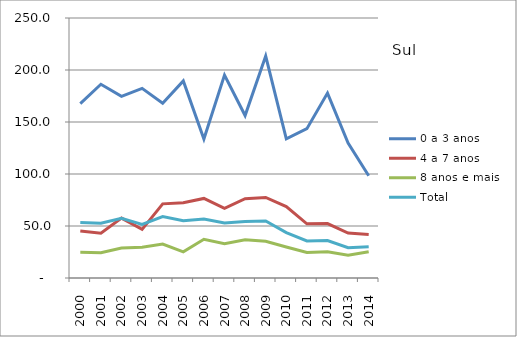
| Category | 0 a 3 anos | 4 a 7 anos | 8 anos e mais | Total |
|---|---|---|---|---|
| 2000.0 | 167.6 | 45.3 | 24.7 | 53.4 |
| 2001.0 | 186.3 | 43.1 | 24.3 | 52.6 |
| 2002.0 | 174.6 | 57.6 | 28.9 | 57.4 |
| 2003.0 | 182.3 | 46.7 | 29.5 | 51.6 |
| 2004.0 | 168 | 71.3 | 32.6 | 59 |
| 2005.0 | 189.5 | 72.4 | 25.1 | 55.1 |
| 2006.0 | 133.6 | 76.5 | 37.2 | 56.7 |
| 2007.0 | 195.1 | 66.9 | 32.9 | 52.9 |
| 2008.0 | 156.2 | 76.2 | 36.8 | 54.4 |
| 2009.0 | 213.4 | 77.5 | 35.4 | 54.9 |
| 2010.0 | 133.839 | 68.695 | 29.763 | 43.722 |
| 2011.0 | 143.616 | 52.089 | 24.461 | 35.648 |
| 2012.0 | 177.785 | 52.319 | 25.2 | 36.094 |
| 2013.0 | 129.715 | 43.168 | 21.781 | 29.096 |
| 2014.0 | 98.264 | 41.752 | 25.229 | 30.128 |